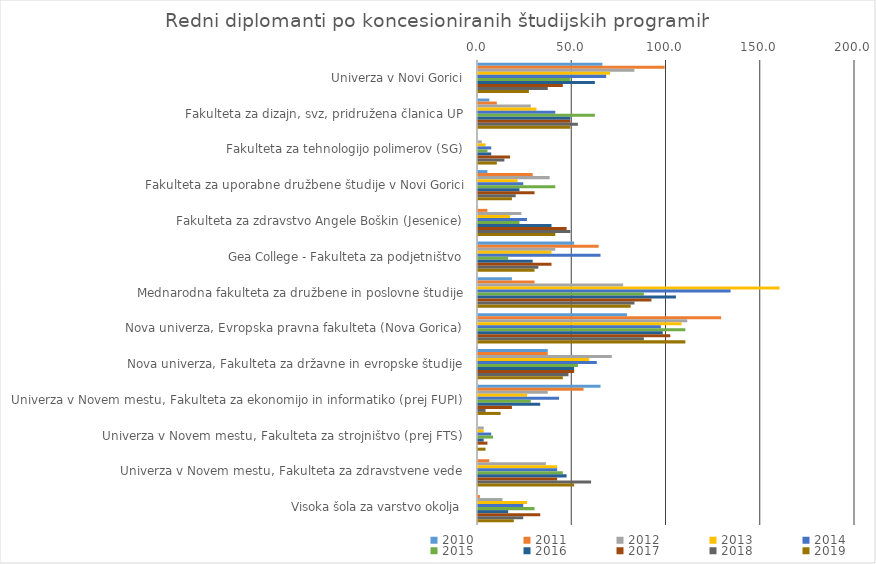
| Category | 2010 | 2011 | 2012 | 2013 | 2014 | 2015 | 2016 | 2017 | 2018 | 2019 |
|---|---|---|---|---|---|---|---|---|---|---|
| Univerza v Novi Gorici | 66 | 99 | 83 | 70 | 68 | 49 | 62 | 45 | 37 | 27 |
| Fakulteta za dizajn, svz, pridružena članica UP | 6 | 10 | 28 | 31 | 41 | 62 | 49 | 49 | 53 | 49 |
| Fakulteta za tehnologijo polimerov (SG) | 0 | 0 | 2 | 4 | 7 | 5 | 7 | 17 | 14 | 10 |
| Fakulteta za uporabne družbene študije v Novi Gorici | 5 | 29 | 38 | 21 | 24 | 41 | 22 | 30 | 20 | 18 |
| Fakulteta za zdravstvo Angele Boškin (Jesenice) | 0 | 5 | 23 | 17 | 26 | 22 | 39 | 47 | 49 | 41 |
| Gea College - Fakulteta za podjetništvo | 51 | 64 | 41 | 39 | 65 | 16 | 29 | 39 | 32 | 30 |
| Mednarodna fakulteta za družbene in poslovne študije | 18 | 30 | 77 | 160 | 134 | 88 | 105 | 92 | 83 | 81 |
| Nova univerza, Evropska pravna fakulteta (Nova Gorica) | 79 | 129 | 111 | 108 | 97 | 110 | 98 | 102 | 88 | 110 |
| Nova univerza, Fakulteta za državne in evropske študije | 37 | 37 | 71 | 59 | 63 | 53 | 51 | 51 | 48 | 45 |
| Univerza v Novem mestu, Fakulteta za ekonomijo in informatiko (prej FUPI) | 65 | 56 | 37 | 26 | 43 | 28 | 33 | 18 | 4 | 12 |
| Univerza v Novem mestu, Fakulteta za strojništvo (prej FTS) | 0 | 0 | 3 | 3 | 7 | 8 | 3 | 5 | 0 | 4 |
| Univerza v Novem mestu, Fakulteta za zdravstvene vede | 0 | 6 | 36 | 42 | 42 | 45 | 47 | 42 | 60 | 51 |
| Visoka šola za varstvo okolja | 0 | 1 | 13 | 26 | 24 | 30 | 16 | 33 | 24 | 19 |